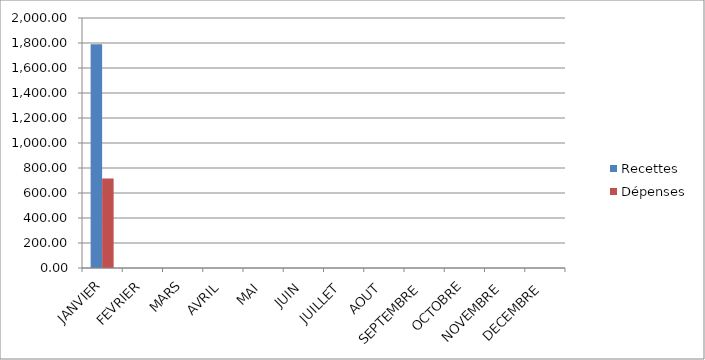
| Category | Recettes | Dépenses |
|---|---|---|
| JANVIER | 1790 | 716 |
| FEVRIER | 0 | 0 |
| MARS | 0 | 0 |
| AVRIL | 0 | 0 |
| MAI | 0 | 0 |
| JUIN | 0 | 0 |
| JUILLET | 0 | 0 |
| AOUT | 0 | 0 |
| SEPTEMBRE | 0 | 0 |
| OCTOBRE | 0 | 0 |
| NOVEMBRE | 0 | 0 |
| DECEMBRE | 0 | 0 |